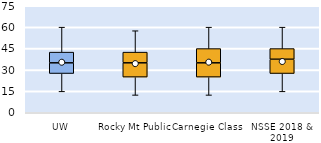
| Category | 25th | 50th | 75th |
|---|---|---|---|
| UW | 27.5 | 7.5 | 7.5 |
| Rocky Mt Public | 25 | 10 | 7.5 |
| Carnegie Class | 25 | 10 | 10 |
| NSSE 2018 & 2019 | 27.5 | 10 | 7.5 |